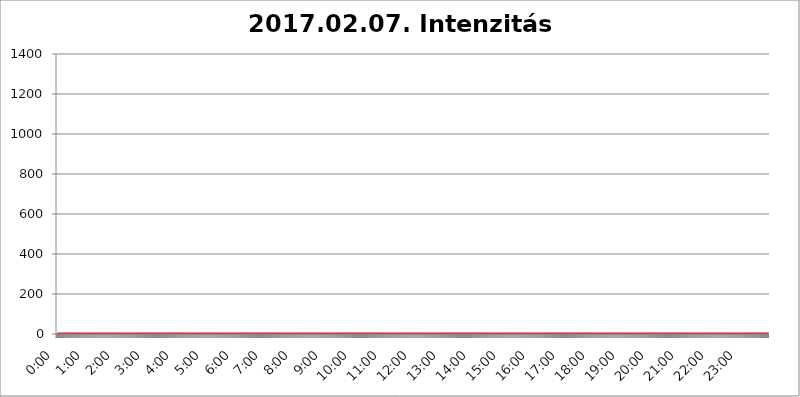
| Category | 2017.02.07. Intenzitás [W/m^2] |
|---|---|
| 0.0 | 0 |
| 0.0006944444444444445 | 0 |
| 0.001388888888888889 | 0 |
| 0.0020833333333333333 | 0 |
| 0.002777777777777778 | 0 |
| 0.003472222222222222 | 0 |
| 0.004166666666666667 | 0 |
| 0.004861111111111111 | 0 |
| 0.005555555555555556 | 0 |
| 0.0062499999999999995 | 0 |
| 0.006944444444444444 | 0 |
| 0.007638888888888889 | 0 |
| 0.008333333333333333 | 0 |
| 0.009027777777777779 | 0 |
| 0.009722222222222222 | 0 |
| 0.010416666666666666 | 0 |
| 0.011111111111111112 | 0 |
| 0.011805555555555555 | 0 |
| 0.012499999999999999 | 0 |
| 0.013194444444444444 | 0 |
| 0.013888888888888888 | 0 |
| 0.014583333333333332 | 0 |
| 0.015277777777777777 | 0 |
| 0.015972222222222224 | 0 |
| 0.016666666666666666 | 0 |
| 0.017361111111111112 | 0 |
| 0.018055555555555557 | 0 |
| 0.01875 | 0 |
| 0.019444444444444445 | 0 |
| 0.02013888888888889 | 0 |
| 0.020833333333333332 | 0 |
| 0.02152777777777778 | 0 |
| 0.022222222222222223 | 0 |
| 0.02291666666666667 | 0 |
| 0.02361111111111111 | 0 |
| 0.024305555555555556 | 0 |
| 0.024999999999999998 | 0 |
| 0.025694444444444447 | 0 |
| 0.02638888888888889 | 0 |
| 0.027083333333333334 | 0 |
| 0.027777777777777776 | 0 |
| 0.02847222222222222 | 0 |
| 0.029166666666666664 | 0 |
| 0.029861111111111113 | 0 |
| 0.030555555555555555 | 0 |
| 0.03125 | 0 |
| 0.03194444444444445 | 0 |
| 0.03263888888888889 | 0 |
| 0.03333333333333333 | 0 |
| 0.034027777777777775 | 0 |
| 0.034722222222222224 | 0 |
| 0.035416666666666666 | 0 |
| 0.036111111111111115 | 0 |
| 0.03680555555555556 | 0 |
| 0.0375 | 0 |
| 0.03819444444444444 | 0 |
| 0.03888888888888889 | 0 |
| 0.03958333333333333 | 0 |
| 0.04027777777777778 | 0 |
| 0.04097222222222222 | 0 |
| 0.041666666666666664 | 0 |
| 0.042361111111111106 | 0 |
| 0.04305555555555556 | 0 |
| 0.043750000000000004 | 0 |
| 0.044444444444444446 | 0 |
| 0.04513888888888889 | 0 |
| 0.04583333333333334 | 0 |
| 0.04652777777777778 | 0 |
| 0.04722222222222222 | 0 |
| 0.04791666666666666 | 0 |
| 0.04861111111111111 | 0 |
| 0.049305555555555554 | 0 |
| 0.049999999999999996 | 0 |
| 0.05069444444444445 | 0 |
| 0.051388888888888894 | 0 |
| 0.052083333333333336 | 0 |
| 0.05277777777777778 | 0 |
| 0.05347222222222222 | 0 |
| 0.05416666666666667 | 0 |
| 0.05486111111111111 | 0 |
| 0.05555555555555555 | 0 |
| 0.05625 | 0 |
| 0.05694444444444444 | 0 |
| 0.057638888888888885 | 0 |
| 0.05833333333333333 | 0 |
| 0.05902777777777778 | 0 |
| 0.059722222222222225 | 0 |
| 0.06041666666666667 | 0 |
| 0.061111111111111116 | 0 |
| 0.06180555555555556 | 0 |
| 0.0625 | 0 |
| 0.06319444444444444 | 0 |
| 0.06388888888888888 | 0 |
| 0.06458333333333334 | 0 |
| 0.06527777777777778 | 0 |
| 0.06597222222222222 | 0 |
| 0.06666666666666667 | 0 |
| 0.06736111111111111 | 0 |
| 0.06805555555555555 | 0 |
| 0.06874999999999999 | 0 |
| 0.06944444444444443 | 0 |
| 0.07013888888888889 | 0 |
| 0.07083333333333333 | 0 |
| 0.07152777777777779 | 0 |
| 0.07222222222222223 | 0 |
| 0.07291666666666667 | 0 |
| 0.07361111111111111 | 0 |
| 0.07430555555555556 | 0 |
| 0.075 | 0 |
| 0.07569444444444444 | 0 |
| 0.0763888888888889 | 0 |
| 0.07708333333333334 | 0 |
| 0.07777777777777778 | 0 |
| 0.07847222222222222 | 0 |
| 0.07916666666666666 | 0 |
| 0.0798611111111111 | 0 |
| 0.08055555555555556 | 0 |
| 0.08125 | 0 |
| 0.08194444444444444 | 0 |
| 0.08263888888888889 | 0 |
| 0.08333333333333333 | 0 |
| 0.08402777777777777 | 0 |
| 0.08472222222222221 | 0 |
| 0.08541666666666665 | 0 |
| 0.08611111111111112 | 0 |
| 0.08680555555555557 | 0 |
| 0.08750000000000001 | 0 |
| 0.08819444444444445 | 0 |
| 0.08888888888888889 | 0 |
| 0.08958333333333333 | 0 |
| 0.09027777777777778 | 0 |
| 0.09097222222222222 | 0 |
| 0.09166666666666667 | 0 |
| 0.09236111111111112 | 0 |
| 0.09305555555555556 | 0 |
| 0.09375 | 0 |
| 0.09444444444444444 | 0 |
| 0.09513888888888888 | 0 |
| 0.09583333333333333 | 0 |
| 0.09652777777777777 | 0 |
| 0.09722222222222222 | 0 |
| 0.09791666666666667 | 0 |
| 0.09861111111111111 | 0 |
| 0.09930555555555555 | 0 |
| 0.09999999999999999 | 0 |
| 0.10069444444444443 | 0 |
| 0.1013888888888889 | 0 |
| 0.10208333333333335 | 0 |
| 0.10277777777777779 | 0 |
| 0.10347222222222223 | 0 |
| 0.10416666666666667 | 0 |
| 0.10486111111111111 | 0 |
| 0.10555555555555556 | 0 |
| 0.10625 | 0 |
| 0.10694444444444444 | 0 |
| 0.1076388888888889 | 0 |
| 0.10833333333333334 | 0 |
| 0.10902777777777778 | 0 |
| 0.10972222222222222 | 0 |
| 0.1111111111111111 | 0 |
| 0.11180555555555556 | 0 |
| 0.11180555555555556 | 0 |
| 0.1125 | 0 |
| 0.11319444444444444 | 0 |
| 0.11388888888888889 | 0 |
| 0.11458333333333333 | 0 |
| 0.11527777777777777 | 0 |
| 0.11597222222222221 | 0 |
| 0.11666666666666665 | 0 |
| 0.1173611111111111 | 0 |
| 0.11805555555555557 | 0 |
| 0.11944444444444445 | 0 |
| 0.12013888888888889 | 0 |
| 0.12083333333333333 | 0 |
| 0.12152777777777778 | 0 |
| 0.12222222222222223 | 0 |
| 0.12291666666666667 | 0 |
| 0.12291666666666667 | 0 |
| 0.12361111111111112 | 0 |
| 0.12430555555555556 | 0 |
| 0.125 | 0 |
| 0.12569444444444444 | 0 |
| 0.12638888888888888 | 0 |
| 0.12708333333333333 | 0 |
| 0.16875 | 0 |
| 0.12847222222222224 | 0 |
| 0.12916666666666668 | 0 |
| 0.12986111111111112 | 0 |
| 0.13055555555555556 | 0 |
| 0.13125 | 0 |
| 0.13194444444444445 | 0 |
| 0.1326388888888889 | 0 |
| 0.13333333333333333 | 0 |
| 0.13402777777777777 | 0 |
| 0.13402777777777777 | 0 |
| 0.13472222222222222 | 0 |
| 0.13541666666666666 | 0 |
| 0.1361111111111111 | 0 |
| 0.13749999999999998 | 0 |
| 0.13819444444444443 | 0 |
| 0.1388888888888889 | 0 |
| 0.13958333333333334 | 0 |
| 0.14027777777777778 | 0 |
| 0.14097222222222222 | 0 |
| 0.14166666666666666 | 0 |
| 0.1423611111111111 | 0 |
| 0.14305555555555557 | 0 |
| 0.14375000000000002 | 0 |
| 0.14444444444444446 | 0 |
| 0.1451388888888889 | 0 |
| 0.1451388888888889 | 0 |
| 0.14652777777777778 | 0 |
| 0.14722222222222223 | 0 |
| 0.14791666666666667 | 0 |
| 0.1486111111111111 | 0 |
| 0.14930555555555555 | 0 |
| 0.15 | 0 |
| 0.15069444444444444 | 0 |
| 0.15138888888888888 | 0 |
| 0.15208333333333332 | 0 |
| 0.15277777777777776 | 0 |
| 0.15347222222222223 | 0 |
| 0.15416666666666667 | 0 |
| 0.15486111111111112 | 0 |
| 0.15555555555555556 | 0 |
| 0.15625 | 0 |
| 0.15694444444444444 | 0 |
| 0.15763888888888888 | 0 |
| 0.15833333333333333 | 0 |
| 0.15902777777777777 | 0 |
| 0.15972222222222224 | 0 |
| 0.16041666666666668 | 0 |
| 0.16111111111111112 | 0 |
| 0.16180555555555556 | 0 |
| 0.1625 | 0 |
| 0.16319444444444445 | 0 |
| 0.1638888888888889 | 0 |
| 0.16458333333333333 | 0 |
| 0.16527777777777777 | 0 |
| 0.16597222222222222 | 0 |
| 0.16666666666666666 | 0 |
| 0.1673611111111111 | 0 |
| 0.16805555555555554 | 0 |
| 0.16874999999999998 | 0 |
| 0.16944444444444443 | 0 |
| 0.17013888888888887 | 0 |
| 0.1708333333333333 | 0 |
| 0.17152777777777775 | 0 |
| 0.17222222222222225 | 0 |
| 0.1729166666666667 | 0 |
| 0.17361111111111113 | 0 |
| 0.17430555555555557 | 0 |
| 0.17500000000000002 | 0 |
| 0.17569444444444446 | 0 |
| 0.1763888888888889 | 0 |
| 0.17708333333333334 | 0 |
| 0.17777777777777778 | 0 |
| 0.17847222222222223 | 0 |
| 0.17916666666666667 | 0 |
| 0.1798611111111111 | 0 |
| 0.18055555555555555 | 0 |
| 0.18125 | 0 |
| 0.18194444444444444 | 0 |
| 0.1826388888888889 | 0 |
| 0.18333333333333335 | 0 |
| 0.1840277777777778 | 0 |
| 0.18472222222222223 | 0 |
| 0.18541666666666667 | 0 |
| 0.18611111111111112 | 0 |
| 0.18680555555555556 | 0 |
| 0.1875 | 0 |
| 0.18819444444444444 | 0 |
| 0.18888888888888888 | 0 |
| 0.18958333333333333 | 0 |
| 0.19027777777777777 | 0 |
| 0.1909722222222222 | 0 |
| 0.19166666666666665 | 0 |
| 0.19236111111111112 | 0 |
| 0.19305555555555554 | 0 |
| 0.19375 | 0 |
| 0.19444444444444445 | 0 |
| 0.1951388888888889 | 0 |
| 0.19583333333333333 | 0 |
| 0.19652777777777777 | 0 |
| 0.19722222222222222 | 0 |
| 0.19791666666666666 | 0 |
| 0.1986111111111111 | 0 |
| 0.19930555555555554 | 0 |
| 0.19999999999999998 | 0 |
| 0.20069444444444443 | 0 |
| 0.20138888888888887 | 0 |
| 0.2020833333333333 | 0 |
| 0.2027777777777778 | 0 |
| 0.2034722222222222 | 0 |
| 0.2041666666666667 | 0 |
| 0.20486111111111113 | 0 |
| 0.20555555555555557 | 0 |
| 0.20625000000000002 | 0 |
| 0.20694444444444446 | 0 |
| 0.2076388888888889 | 0 |
| 0.20833333333333334 | 0 |
| 0.20902777777777778 | 0 |
| 0.20972222222222223 | 0 |
| 0.21041666666666667 | 0 |
| 0.2111111111111111 | 0 |
| 0.21180555555555555 | 0 |
| 0.2125 | 0 |
| 0.21319444444444444 | 0 |
| 0.2138888888888889 | 0 |
| 0.21458333333333335 | 0 |
| 0.2152777777777778 | 0 |
| 0.21597222222222223 | 0 |
| 0.21666666666666667 | 0 |
| 0.21736111111111112 | 0 |
| 0.21805555555555556 | 0 |
| 0.21875 | 0 |
| 0.21944444444444444 | 0 |
| 0.22013888888888888 | 0 |
| 0.22083333333333333 | 0 |
| 0.22152777777777777 | 0 |
| 0.2222222222222222 | 0 |
| 0.22291666666666665 | 0 |
| 0.2236111111111111 | 0 |
| 0.22430555555555556 | 0 |
| 0.225 | 0 |
| 0.22569444444444445 | 0 |
| 0.2263888888888889 | 0 |
| 0.22708333333333333 | 0 |
| 0.22777777777777777 | 0 |
| 0.22847222222222222 | 0 |
| 0.22916666666666666 | 0 |
| 0.2298611111111111 | 0 |
| 0.23055555555555554 | 0 |
| 0.23124999999999998 | 0 |
| 0.23194444444444443 | 0 |
| 0.23263888888888887 | 0 |
| 0.2333333333333333 | 0 |
| 0.2340277777777778 | 0 |
| 0.2347222222222222 | 0 |
| 0.2354166666666667 | 0 |
| 0.23611111111111113 | 0 |
| 0.23680555555555557 | 0 |
| 0.23750000000000002 | 0 |
| 0.23819444444444446 | 0 |
| 0.2388888888888889 | 0 |
| 0.23958333333333334 | 0 |
| 0.24027777777777778 | 0 |
| 0.24097222222222223 | 0 |
| 0.24166666666666667 | 0 |
| 0.2423611111111111 | 0 |
| 0.24305555555555555 | 0 |
| 0.24375 | 0 |
| 0.24444444444444446 | 0 |
| 0.24513888888888888 | 0 |
| 0.24583333333333335 | 0 |
| 0.2465277777777778 | 0 |
| 0.24722222222222223 | 0 |
| 0.24791666666666667 | 0 |
| 0.24861111111111112 | 0 |
| 0.24930555555555556 | 0 |
| 0.25 | 0 |
| 0.25069444444444444 | 0 |
| 0.2513888888888889 | 0 |
| 0.2520833333333333 | 0 |
| 0.25277777777777777 | 0 |
| 0.2534722222222222 | 0 |
| 0.25416666666666665 | 0 |
| 0.2548611111111111 | 0 |
| 0.2555555555555556 | 0 |
| 0.25625000000000003 | 0 |
| 0.2569444444444445 | 0 |
| 0.2576388888888889 | 0 |
| 0.25833333333333336 | 0 |
| 0.2590277777777778 | 0 |
| 0.25972222222222224 | 0 |
| 0.2604166666666667 | 0 |
| 0.2611111111111111 | 0 |
| 0.26180555555555557 | 0 |
| 0.2625 | 0 |
| 0.26319444444444445 | 0 |
| 0.2638888888888889 | 0 |
| 0.26458333333333334 | 0 |
| 0.2652777777777778 | 0 |
| 0.2659722222222222 | 0 |
| 0.26666666666666666 | 0 |
| 0.2673611111111111 | 0 |
| 0.26805555555555555 | 0 |
| 0.26875 | 0 |
| 0.26944444444444443 | 0 |
| 0.2701388888888889 | 0 |
| 0.2708333333333333 | 0 |
| 0.27152777777777776 | 0 |
| 0.2722222222222222 | 0 |
| 0.27291666666666664 | 0 |
| 0.2736111111111111 | 0 |
| 0.2743055555555555 | 0 |
| 0.27499999999999997 | 0 |
| 0.27569444444444446 | 0 |
| 0.27638888888888885 | 0 |
| 0.27708333333333335 | 0 |
| 0.2777777777777778 | 0 |
| 0.27847222222222223 | 0 |
| 0.2791666666666667 | 0 |
| 0.2798611111111111 | 0 |
| 0.28055555555555556 | 0 |
| 0.28125 | 0 |
| 0.28194444444444444 | 0 |
| 0.2826388888888889 | 0 |
| 0.2833333333333333 | 0 |
| 0.28402777777777777 | 0 |
| 0.2847222222222222 | 0 |
| 0.28541666666666665 | 0 |
| 0.28611111111111115 | 0 |
| 0.28680555555555554 | 0 |
| 0.28750000000000003 | 0 |
| 0.2881944444444445 | 0 |
| 0.2888888888888889 | 0 |
| 0.28958333333333336 | 0 |
| 0.2902777777777778 | 0 |
| 0.29097222222222224 | 0 |
| 0.2916666666666667 | 0 |
| 0.2923611111111111 | 0 |
| 0.29305555555555557 | 0 |
| 0.29375 | 0 |
| 0.29444444444444445 | 0 |
| 0.2951388888888889 | 0 |
| 0.29583333333333334 | 0 |
| 0.2965277777777778 | 0 |
| 0.2972222222222222 | 0 |
| 0.29791666666666666 | 0 |
| 0.2986111111111111 | 0 |
| 0.29930555555555555 | 0 |
| 0.3 | 0 |
| 0.30069444444444443 | 0 |
| 0.3013888888888889 | 0 |
| 0.3020833333333333 | 0 |
| 0.30277777777777776 | 0 |
| 0.3034722222222222 | 0 |
| 0.30416666666666664 | 0 |
| 0.3048611111111111 | 0 |
| 0.3055555555555555 | 0 |
| 0.30624999999999997 | 0 |
| 0.3069444444444444 | 0 |
| 0.3076388888888889 | 0 |
| 0.30833333333333335 | 0 |
| 0.3090277777777778 | 0 |
| 0.30972222222222223 | 0 |
| 0.3104166666666667 | 0 |
| 0.3111111111111111 | 0 |
| 0.31180555555555556 | 0 |
| 0.3125 | 0 |
| 0.31319444444444444 | 0 |
| 0.3138888888888889 | 0 |
| 0.3145833333333333 | 0 |
| 0.31527777777777777 | 0 |
| 0.3159722222222222 | 0 |
| 0.31666666666666665 | 0 |
| 0.31736111111111115 | 0 |
| 0.31805555555555554 | 0 |
| 0.31875000000000003 | 0 |
| 0.3194444444444445 | 0 |
| 0.3201388888888889 | 0 |
| 0.32083333333333336 | 0 |
| 0.3215277777777778 | 0 |
| 0.32222222222222224 | 0 |
| 0.3229166666666667 | 0 |
| 0.3236111111111111 | 0 |
| 0.32430555555555557 | 0 |
| 0.325 | 0 |
| 0.32569444444444445 | 0 |
| 0.3263888888888889 | 0 |
| 0.32708333333333334 | 0 |
| 0.3277777777777778 | 0 |
| 0.3284722222222222 | 0 |
| 0.32916666666666666 | 0 |
| 0.3298611111111111 | 0 |
| 0.33055555555555555 | 0 |
| 0.33125 | 0 |
| 0.33194444444444443 | 0 |
| 0.3326388888888889 | 0 |
| 0.3333333333333333 | 0 |
| 0.3340277777777778 | 0 |
| 0.3347222222222222 | 0 |
| 0.3354166666666667 | 0 |
| 0.3361111111111111 | 0 |
| 0.3368055555555556 | 0 |
| 0.33749999999999997 | 0 |
| 0.33819444444444446 | 0 |
| 0.33888888888888885 | 0 |
| 0.33958333333333335 | 0 |
| 0.34027777777777773 | 0 |
| 0.34097222222222223 | 0 |
| 0.3416666666666666 | 0 |
| 0.3423611111111111 | 0 |
| 0.3430555555555555 | 0 |
| 0.34375 | 0 |
| 0.3444444444444445 | 0 |
| 0.3451388888888889 | 0 |
| 0.3458333333333334 | 0 |
| 0.34652777777777777 | 0 |
| 0.34722222222222227 | 0 |
| 0.34791666666666665 | 0 |
| 0.34861111111111115 | 0 |
| 0.34930555555555554 | 0 |
| 0.35000000000000003 | 0 |
| 0.3506944444444444 | 0 |
| 0.3513888888888889 | 0 |
| 0.3520833333333333 | 0 |
| 0.3527777777777778 | 0 |
| 0.3534722222222222 | 0 |
| 0.3541666666666667 | 0 |
| 0.3548611111111111 | 0 |
| 0.35555555555555557 | 0 |
| 0.35625 | 0 |
| 0.35694444444444445 | 0 |
| 0.3576388888888889 | 0 |
| 0.35833333333333334 | 0 |
| 0.3590277777777778 | 0 |
| 0.3597222222222222 | 0 |
| 0.36041666666666666 | 0 |
| 0.3611111111111111 | 0 |
| 0.36180555555555555 | 0 |
| 0.3625 | 0 |
| 0.36319444444444443 | 0 |
| 0.3638888888888889 | 0 |
| 0.3645833333333333 | 0 |
| 0.3652777777777778 | 0 |
| 0.3659722222222222 | 0 |
| 0.3666666666666667 | 0 |
| 0.3673611111111111 | 0 |
| 0.3680555555555556 | 0 |
| 0.36874999999999997 | 0 |
| 0.36944444444444446 | 0 |
| 0.37013888888888885 | 0 |
| 0.37083333333333335 | 0 |
| 0.37152777777777773 | 0 |
| 0.37222222222222223 | 0 |
| 0.3729166666666666 | 0 |
| 0.3736111111111111 | 0 |
| 0.3743055555555555 | 0 |
| 0.375 | 0 |
| 0.3756944444444445 | 0 |
| 0.3763888888888889 | 0 |
| 0.3770833333333334 | 0 |
| 0.37777777777777777 | 0 |
| 0.37847222222222227 | 0 |
| 0.37916666666666665 | 0 |
| 0.37986111111111115 | 0 |
| 0.38055555555555554 | 0 |
| 0.38125000000000003 | 0 |
| 0.3819444444444444 | 0 |
| 0.3826388888888889 | 0 |
| 0.3833333333333333 | 0 |
| 0.3840277777777778 | 0 |
| 0.3847222222222222 | 0 |
| 0.3854166666666667 | 0 |
| 0.3861111111111111 | 0 |
| 0.38680555555555557 | 0 |
| 0.3875 | 0 |
| 0.38819444444444445 | 0 |
| 0.3888888888888889 | 0 |
| 0.38958333333333334 | 0 |
| 0.3902777777777778 | 0 |
| 0.3909722222222222 | 0 |
| 0.39166666666666666 | 0 |
| 0.3923611111111111 | 0 |
| 0.39305555555555555 | 0 |
| 0.39375 | 0 |
| 0.39444444444444443 | 0 |
| 0.3951388888888889 | 0 |
| 0.3958333333333333 | 0 |
| 0.3965277777777778 | 0 |
| 0.3972222222222222 | 0 |
| 0.3979166666666667 | 0 |
| 0.3986111111111111 | 0 |
| 0.3993055555555556 | 0 |
| 0.39999999999999997 | 0 |
| 0.40069444444444446 | 0 |
| 0.40138888888888885 | 0 |
| 0.40208333333333335 | 0 |
| 0.40277777777777773 | 0 |
| 0.40347222222222223 | 0 |
| 0.4041666666666666 | 0 |
| 0.4048611111111111 | 0 |
| 0.4055555555555555 | 0 |
| 0.40625 | 0 |
| 0.4069444444444445 | 0 |
| 0.4076388888888889 | 0 |
| 0.4083333333333334 | 0 |
| 0.40902777777777777 | 0 |
| 0.40972222222222227 | 0 |
| 0.41041666666666665 | 0 |
| 0.41111111111111115 | 0 |
| 0.41180555555555554 | 0 |
| 0.41250000000000003 | 0 |
| 0.4131944444444444 | 0 |
| 0.4138888888888889 | 0 |
| 0.4145833333333333 | 0 |
| 0.4152777777777778 | 0 |
| 0.4159722222222222 | 0 |
| 0.4166666666666667 | 0 |
| 0.4173611111111111 | 0 |
| 0.41805555555555557 | 0 |
| 0.41875 | 0 |
| 0.41944444444444445 | 0 |
| 0.4201388888888889 | 0 |
| 0.42083333333333334 | 0 |
| 0.4215277777777778 | 0 |
| 0.4222222222222222 | 0 |
| 0.42291666666666666 | 0 |
| 0.4236111111111111 | 0 |
| 0.42430555555555555 | 0 |
| 0.425 | 0 |
| 0.42569444444444443 | 0 |
| 0.4263888888888889 | 0 |
| 0.4270833333333333 | 0 |
| 0.4277777777777778 | 0 |
| 0.4284722222222222 | 0 |
| 0.4291666666666667 | 0 |
| 0.4298611111111111 | 0 |
| 0.4305555555555556 | 0 |
| 0.43124999999999997 | 0 |
| 0.43194444444444446 | 0 |
| 0.43263888888888885 | 0 |
| 0.43333333333333335 | 0 |
| 0.43402777777777773 | 0 |
| 0.43472222222222223 | 0 |
| 0.4354166666666666 | 0 |
| 0.4361111111111111 | 0 |
| 0.4368055555555555 | 0 |
| 0.4375 | 0 |
| 0.4381944444444445 | 0 |
| 0.4388888888888889 | 0 |
| 0.4395833333333334 | 0 |
| 0.44027777777777777 | 0 |
| 0.44097222222222227 | 0 |
| 0.44166666666666665 | 0 |
| 0.44236111111111115 | 0 |
| 0.44305555555555554 | 0 |
| 0.44375000000000003 | 0 |
| 0.4444444444444444 | 0 |
| 0.4451388888888889 | 0 |
| 0.4458333333333333 | 0 |
| 0.4465277777777778 | 0 |
| 0.4472222222222222 | 0 |
| 0.4479166666666667 | 0 |
| 0.4486111111111111 | 0 |
| 0.44930555555555557 | 0 |
| 0.45 | 0 |
| 0.45069444444444445 | 0 |
| 0.4513888888888889 | 0 |
| 0.45208333333333334 | 0 |
| 0.4527777777777778 | 0 |
| 0.4534722222222222 | 0 |
| 0.45416666666666666 | 0 |
| 0.4548611111111111 | 0 |
| 0.45555555555555555 | 0 |
| 0.45625 | 0 |
| 0.45694444444444443 | 0 |
| 0.4576388888888889 | 0 |
| 0.4583333333333333 | 0 |
| 0.4590277777777778 | 0 |
| 0.4597222222222222 | 0 |
| 0.4604166666666667 | 0 |
| 0.4611111111111111 | 0 |
| 0.4618055555555556 | 0 |
| 0.46249999999999997 | 0 |
| 0.46319444444444446 | 0 |
| 0.46388888888888885 | 0 |
| 0.46458333333333335 | 0 |
| 0.46527777777777773 | 0 |
| 0.46597222222222223 | 0 |
| 0.4666666666666666 | 0 |
| 0.4673611111111111 | 0 |
| 0.4680555555555555 | 0 |
| 0.46875 | 0 |
| 0.4694444444444445 | 0 |
| 0.4701388888888889 | 0 |
| 0.4708333333333334 | 0 |
| 0.47152777777777777 | 0 |
| 0.47222222222222227 | 0 |
| 0.47291666666666665 | 0 |
| 0.47361111111111115 | 0 |
| 0.47430555555555554 | 0 |
| 0.47500000000000003 | 0 |
| 0.4756944444444444 | 0 |
| 0.4763888888888889 | 0 |
| 0.4770833333333333 | 0 |
| 0.4777777777777778 | 0 |
| 0.4784722222222222 | 0 |
| 0.4791666666666667 | 0 |
| 0.4798611111111111 | 0 |
| 0.48055555555555557 | 0 |
| 0.48125 | 0 |
| 0.48194444444444445 | 0 |
| 0.4826388888888889 | 0 |
| 0.48333333333333334 | 0 |
| 0.4840277777777778 | 0 |
| 0.4847222222222222 | 0 |
| 0.48541666666666666 | 0 |
| 0.4861111111111111 | 0 |
| 0.48680555555555555 | 0 |
| 0.4875 | 0 |
| 0.48819444444444443 | 0 |
| 0.4888888888888889 | 0 |
| 0.4895833333333333 | 0 |
| 0.4902777777777778 | 0 |
| 0.4909722222222222 | 0 |
| 0.4916666666666667 | 0 |
| 0.4923611111111111 | 0 |
| 0.4930555555555556 | 0 |
| 0.49374999999999997 | 0 |
| 0.49444444444444446 | 0 |
| 0.49513888888888885 | 0 |
| 0.49583333333333335 | 0 |
| 0.49652777777777773 | 0 |
| 0.49722222222222223 | 0 |
| 0.4979166666666666 | 0 |
| 0.4986111111111111 | 0 |
| 0.4993055555555555 | 0 |
| 0.5 | 0 |
| 0.5006944444444444 | 0 |
| 0.5013888888888889 | 0 |
| 0.5020833333333333 | 0 |
| 0.5027777777777778 | 0 |
| 0.5034722222222222 | 0 |
| 0.5041666666666667 | 0 |
| 0.5048611111111111 | 0 |
| 0.5055555555555555 | 0 |
| 0.50625 | 0 |
| 0.5069444444444444 | 0 |
| 0.5076388888888889 | 0 |
| 0.5083333333333333 | 0 |
| 0.5090277777777777 | 0 |
| 0.5097222222222222 | 0 |
| 0.5104166666666666 | 0 |
| 0.5111111111111112 | 0 |
| 0.5118055555555555 | 0 |
| 0.5125000000000001 | 0 |
| 0.5131944444444444 | 0 |
| 0.513888888888889 | 0 |
| 0.5145833333333333 | 0 |
| 0.5152777777777778 | 0 |
| 0.5159722222222222 | 0 |
| 0.5166666666666667 | 0 |
| 0.517361111111111 | 0 |
| 0.5180555555555556 | 0 |
| 0.5187499999999999 | 0 |
| 0.5194444444444445 | 0 |
| 0.5201388888888888 | 0 |
| 0.5208333333333334 | 0 |
| 0.5215277777777778 | 0 |
| 0.5222222222222223 | 0 |
| 0.5229166666666667 | 0 |
| 0.5236111111111111 | 0 |
| 0.5243055555555556 | 0 |
| 0.525 | 0 |
| 0.5256944444444445 | 0 |
| 0.5263888888888889 | 0 |
| 0.5270833333333333 | 0 |
| 0.5277777777777778 | 0 |
| 0.5284722222222222 | 0 |
| 0.5291666666666667 | 0 |
| 0.5298611111111111 | 0 |
| 0.5305555555555556 | 0 |
| 0.53125 | 0 |
| 0.5319444444444444 | 0 |
| 0.5326388888888889 | 0 |
| 0.5333333333333333 | 0 |
| 0.5340277777777778 | 0 |
| 0.5347222222222222 | 0 |
| 0.5354166666666667 | 0 |
| 0.5361111111111111 | 0 |
| 0.5368055555555555 | 0 |
| 0.5375 | 0 |
| 0.5381944444444444 | 0 |
| 0.5388888888888889 | 0 |
| 0.5395833333333333 | 0 |
| 0.5402777777777777 | 0 |
| 0.5409722222222222 | 0 |
| 0.5416666666666666 | 0 |
| 0.5423611111111112 | 0 |
| 0.5430555555555555 | 0 |
| 0.5437500000000001 | 0 |
| 0.5444444444444444 | 0 |
| 0.545138888888889 | 0 |
| 0.5458333333333333 | 0 |
| 0.5465277777777778 | 0 |
| 0.5472222222222222 | 0 |
| 0.5479166666666667 | 0 |
| 0.548611111111111 | 0 |
| 0.5493055555555556 | 0 |
| 0.5499999999999999 | 0 |
| 0.5506944444444445 | 0 |
| 0.5513888888888888 | 0 |
| 0.5520833333333334 | 0 |
| 0.5527777777777778 | 0 |
| 0.5534722222222223 | 0 |
| 0.5541666666666667 | 0 |
| 0.5548611111111111 | 0 |
| 0.5555555555555556 | 0 |
| 0.55625 | 0 |
| 0.5569444444444445 | 0 |
| 0.5576388888888889 | 0 |
| 0.5583333333333333 | 0 |
| 0.5590277777777778 | 0 |
| 0.5597222222222222 | 0 |
| 0.5604166666666667 | 0 |
| 0.5611111111111111 | 0 |
| 0.5618055555555556 | 0 |
| 0.5625 | 0 |
| 0.5631944444444444 | 0 |
| 0.5638888888888889 | 0 |
| 0.5645833333333333 | 0 |
| 0.5652777777777778 | 0 |
| 0.5659722222222222 | 0 |
| 0.5666666666666667 | 0 |
| 0.5673611111111111 | 0 |
| 0.5680555555555555 | 0 |
| 0.56875 | 0 |
| 0.5694444444444444 | 0 |
| 0.5701388888888889 | 0 |
| 0.5708333333333333 | 0 |
| 0.5715277777777777 | 0 |
| 0.5722222222222222 | 0 |
| 0.5729166666666666 | 0 |
| 0.5736111111111112 | 0 |
| 0.5743055555555555 | 0 |
| 0.5750000000000001 | 0 |
| 0.5756944444444444 | 0 |
| 0.576388888888889 | 0 |
| 0.5770833333333333 | 0 |
| 0.5777777777777778 | 0 |
| 0.5784722222222222 | 0 |
| 0.5791666666666667 | 0 |
| 0.579861111111111 | 0 |
| 0.5805555555555556 | 0 |
| 0.5812499999999999 | 0 |
| 0.5819444444444445 | 0 |
| 0.5826388888888888 | 0 |
| 0.5833333333333334 | 0 |
| 0.5840277777777778 | 0 |
| 0.5847222222222223 | 0 |
| 0.5854166666666667 | 0 |
| 0.5861111111111111 | 0 |
| 0.5868055555555556 | 0 |
| 0.5875 | 0 |
| 0.5881944444444445 | 0 |
| 0.5888888888888889 | 0 |
| 0.5895833333333333 | 0 |
| 0.5902777777777778 | 0 |
| 0.5909722222222222 | 0 |
| 0.5916666666666667 | 0 |
| 0.5923611111111111 | 0 |
| 0.5930555555555556 | 0 |
| 0.59375 | 0 |
| 0.5944444444444444 | 0 |
| 0.5951388888888889 | 0 |
| 0.5958333333333333 | 0 |
| 0.5965277777777778 | 0 |
| 0.5972222222222222 | 0 |
| 0.5979166666666667 | 0 |
| 0.5986111111111111 | 0 |
| 0.5993055555555555 | 0 |
| 0.6 | 0 |
| 0.6006944444444444 | 0 |
| 0.6013888888888889 | 0 |
| 0.6020833333333333 | 0 |
| 0.6027777777777777 | 0 |
| 0.6034722222222222 | 0 |
| 0.6041666666666666 | 0 |
| 0.6048611111111112 | 0 |
| 0.6055555555555555 | 0 |
| 0.6062500000000001 | 0 |
| 0.6069444444444444 | 0 |
| 0.607638888888889 | 0 |
| 0.6083333333333333 | 0 |
| 0.6090277777777778 | 0 |
| 0.6097222222222222 | 0 |
| 0.6104166666666667 | 0 |
| 0.611111111111111 | 0 |
| 0.6118055555555556 | 0 |
| 0.6124999999999999 | 0 |
| 0.6131944444444445 | 0 |
| 0.6138888888888888 | 0 |
| 0.6145833333333334 | 0 |
| 0.6152777777777778 | 0 |
| 0.6159722222222223 | 0 |
| 0.6166666666666667 | 0 |
| 0.6173611111111111 | 0 |
| 0.6180555555555556 | 0 |
| 0.61875 | 0 |
| 0.6194444444444445 | 0 |
| 0.6201388888888889 | 0 |
| 0.6208333333333333 | 0 |
| 0.6215277777777778 | 0 |
| 0.6222222222222222 | 0 |
| 0.6229166666666667 | 0 |
| 0.6236111111111111 | 0 |
| 0.6243055555555556 | 0 |
| 0.625 | 0 |
| 0.6256944444444444 | 0 |
| 0.6263888888888889 | 0 |
| 0.6270833333333333 | 0 |
| 0.6277777777777778 | 0 |
| 0.6284722222222222 | 0 |
| 0.6291666666666667 | 0 |
| 0.6298611111111111 | 0 |
| 0.6305555555555555 | 0 |
| 0.63125 | 0 |
| 0.6319444444444444 | 0 |
| 0.6326388888888889 | 0 |
| 0.6333333333333333 | 0 |
| 0.6340277777777777 | 0 |
| 0.6347222222222222 | 0 |
| 0.6354166666666666 | 0 |
| 0.6361111111111112 | 0 |
| 0.6368055555555555 | 0 |
| 0.6375000000000001 | 0 |
| 0.6381944444444444 | 0 |
| 0.638888888888889 | 0 |
| 0.6395833333333333 | 0 |
| 0.6402777777777778 | 0 |
| 0.6409722222222222 | 0 |
| 0.6416666666666667 | 0 |
| 0.642361111111111 | 0 |
| 0.6430555555555556 | 0 |
| 0.6437499999999999 | 0 |
| 0.6444444444444445 | 0 |
| 0.6451388888888888 | 0 |
| 0.6458333333333334 | 0 |
| 0.6465277777777778 | 0 |
| 0.6472222222222223 | 0 |
| 0.6479166666666667 | 0 |
| 0.6486111111111111 | 0 |
| 0.6493055555555556 | 0 |
| 0.65 | 0 |
| 0.6506944444444445 | 0 |
| 0.6513888888888889 | 0 |
| 0.6520833333333333 | 0 |
| 0.6527777777777778 | 0 |
| 0.6534722222222222 | 0 |
| 0.6541666666666667 | 0 |
| 0.6548611111111111 | 0 |
| 0.6555555555555556 | 0 |
| 0.65625 | 0 |
| 0.6569444444444444 | 0 |
| 0.6576388888888889 | 0 |
| 0.6583333333333333 | 0 |
| 0.6590277777777778 | 0 |
| 0.6597222222222222 | 0 |
| 0.6604166666666667 | 0 |
| 0.6611111111111111 | 0 |
| 0.6618055555555555 | 0 |
| 0.6625 | 0 |
| 0.6631944444444444 | 0 |
| 0.6638888888888889 | 0 |
| 0.6645833333333333 | 0 |
| 0.6652777777777777 | 0 |
| 0.6659722222222222 | 0 |
| 0.6666666666666666 | 0 |
| 0.6673611111111111 | 0 |
| 0.6680555555555556 | 0 |
| 0.6687500000000001 | 0 |
| 0.6694444444444444 | 0 |
| 0.6701388888888888 | 0 |
| 0.6708333333333334 | 0 |
| 0.6715277777777778 | 0 |
| 0.6722222222222222 | 0 |
| 0.6729166666666666 | 0 |
| 0.6736111111111112 | 0 |
| 0.6743055555555556 | 0 |
| 0.6749999999999999 | 0 |
| 0.6756944444444444 | 0 |
| 0.6763888888888889 | 0 |
| 0.6770833333333334 | 0 |
| 0.6777777777777777 | 0 |
| 0.6784722222222223 | 0 |
| 0.6791666666666667 | 0 |
| 0.6798611111111111 | 0 |
| 0.6805555555555555 | 0 |
| 0.68125 | 0 |
| 0.6819444444444445 | 0 |
| 0.6826388888888889 | 0 |
| 0.6833333333333332 | 0 |
| 0.6840277777777778 | 0 |
| 0.6847222222222222 | 0 |
| 0.6854166666666667 | 0 |
| 0.686111111111111 | 0 |
| 0.6868055555555556 | 0 |
| 0.6875 | 0 |
| 0.6881944444444444 | 0 |
| 0.688888888888889 | 0 |
| 0.6895833333333333 | 0 |
| 0.6902777777777778 | 0 |
| 0.6909722222222222 | 0 |
| 0.6916666666666668 | 0 |
| 0.6923611111111111 | 0 |
| 0.6930555555555555 | 0 |
| 0.69375 | 0 |
| 0.6944444444444445 | 0 |
| 0.6951388888888889 | 0 |
| 0.6958333333333333 | 0 |
| 0.6965277777777777 | 0 |
| 0.6972222222222223 | 0 |
| 0.6979166666666666 | 0 |
| 0.6986111111111111 | 0 |
| 0.6993055555555556 | 0 |
| 0.7000000000000001 | 0 |
| 0.7006944444444444 | 0 |
| 0.7013888888888888 | 0 |
| 0.7020833333333334 | 0 |
| 0.7027777777777778 | 0 |
| 0.7034722222222222 | 0 |
| 0.7041666666666666 | 0 |
| 0.7048611111111112 | 0 |
| 0.7055555555555556 | 0 |
| 0.7062499999999999 | 0 |
| 0.7069444444444444 | 0 |
| 0.7076388888888889 | 0 |
| 0.7083333333333334 | 0 |
| 0.7090277777777777 | 0 |
| 0.7097222222222223 | 0 |
| 0.7104166666666667 | 0 |
| 0.7111111111111111 | 0 |
| 0.7118055555555555 | 0 |
| 0.7125 | 0 |
| 0.7131944444444445 | 0 |
| 0.7138888888888889 | 0 |
| 0.7145833333333332 | 0 |
| 0.7152777777777778 | 0 |
| 0.7159722222222222 | 0 |
| 0.7166666666666667 | 0 |
| 0.717361111111111 | 0 |
| 0.7180555555555556 | 0 |
| 0.71875 | 0 |
| 0.7194444444444444 | 0 |
| 0.720138888888889 | 0 |
| 0.7208333333333333 | 0 |
| 0.7215277777777778 | 0 |
| 0.7222222222222222 | 0 |
| 0.7229166666666668 | 0 |
| 0.7236111111111111 | 0 |
| 0.7243055555555555 | 0 |
| 0.725 | 0 |
| 0.7256944444444445 | 0 |
| 0.7263888888888889 | 0 |
| 0.7270833333333333 | 0 |
| 0.7277777777777777 | 0 |
| 0.7284722222222223 | 0 |
| 0.7291666666666666 | 0 |
| 0.7298611111111111 | 0 |
| 0.7305555555555556 | 0 |
| 0.7312500000000001 | 0 |
| 0.7319444444444444 | 0 |
| 0.7326388888888888 | 0 |
| 0.7333333333333334 | 0 |
| 0.7340277777777778 | 0 |
| 0.7347222222222222 | 0 |
| 0.7354166666666666 | 0 |
| 0.7361111111111112 | 0 |
| 0.7368055555555556 | 0 |
| 0.7374999999999999 | 0 |
| 0.7381944444444444 | 0 |
| 0.7388888888888889 | 0 |
| 0.7395833333333334 | 0 |
| 0.7402777777777777 | 0 |
| 0.7409722222222223 | 0 |
| 0.7416666666666667 | 0 |
| 0.7423611111111111 | 0 |
| 0.7430555555555555 | 0 |
| 0.74375 | 0 |
| 0.7444444444444445 | 0 |
| 0.7451388888888889 | 0 |
| 0.7458333333333332 | 0 |
| 0.7465277777777778 | 0 |
| 0.7472222222222222 | 0 |
| 0.7479166666666667 | 0 |
| 0.748611111111111 | 0 |
| 0.7493055555555556 | 0 |
| 0.75 | 0 |
| 0.7506944444444444 | 0 |
| 0.751388888888889 | 0 |
| 0.7520833333333333 | 0 |
| 0.7527777777777778 | 0 |
| 0.7534722222222222 | 0 |
| 0.7541666666666668 | 0 |
| 0.7548611111111111 | 0 |
| 0.7555555555555555 | 0 |
| 0.75625 | 0 |
| 0.7569444444444445 | 0 |
| 0.7576388888888889 | 0 |
| 0.7583333333333333 | 0 |
| 0.7590277777777777 | 0 |
| 0.7597222222222223 | 0 |
| 0.7604166666666666 | 0 |
| 0.7611111111111111 | 0 |
| 0.7618055555555556 | 0 |
| 0.7625000000000001 | 0 |
| 0.7631944444444444 | 0 |
| 0.7638888888888888 | 0 |
| 0.7645833333333334 | 0 |
| 0.7652777777777778 | 0 |
| 0.7659722222222222 | 0 |
| 0.7666666666666666 | 0 |
| 0.7673611111111112 | 0 |
| 0.7680555555555556 | 0 |
| 0.7687499999999999 | 0 |
| 0.7694444444444444 | 0 |
| 0.7701388888888889 | 0 |
| 0.7708333333333334 | 0 |
| 0.7715277777777777 | 0 |
| 0.7722222222222223 | 0 |
| 0.7729166666666667 | 0 |
| 0.7736111111111111 | 0 |
| 0.7743055555555555 | 0 |
| 0.775 | 0 |
| 0.7756944444444445 | 0 |
| 0.7763888888888889 | 0 |
| 0.7770833333333332 | 0 |
| 0.7777777777777778 | 0 |
| 0.7784722222222222 | 0 |
| 0.7791666666666667 | 0 |
| 0.779861111111111 | 0 |
| 0.7805555555555556 | 0 |
| 0.78125 | 0 |
| 0.7819444444444444 | 0 |
| 0.782638888888889 | 0 |
| 0.7833333333333333 | 0 |
| 0.7840277777777778 | 0 |
| 0.7847222222222222 | 0 |
| 0.7854166666666668 | 0 |
| 0.7861111111111111 | 0 |
| 0.7868055555555555 | 0 |
| 0.7875 | 0 |
| 0.7881944444444445 | 0 |
| 0.7888888888888889 | 0 |
| 0.7895833333333333 | 0 |
| 0.7902777777777777 | 0 |
| 0.7909722222222223 | 0 |
| 0.7916666666666666 | 0 |
| 0.7923611111111111 | 0 |
| 0.7930555555555556 | 0 |
| 0.7937500000000001 | 0 |
| 0.7944444444444444 | 0 |
| 0.7951388888888888 | 0 |
| 0.7958333333333334 | 0 |
| 0.7965277777777778 | 0 |
| 0.7972222222222222 | 0 |
| 0.7979166666666666 | 0 |
| 0.7986111111111112 | 0 |
| 0.7993055555555556 | 0 |
| 0.7999999999999999 | 0 |
| 0.8006944444444444 | 0 |
| 0.8013888888888889 | 0 |
| 0.8020833333333334 | 0 |
| 0.8027777777777777 | 0 |
| 0.8034722222222223 | 0 |
| 0.8041666666666667 | 0 |
| 0.8048611111111111 | 0 |
| 0.8055555555555555 | 0 |
| 0.80625 | 0 |
| 0.8069444444444445 | 0 |
| 0.8076388888888889 | 0 |
| 0.8083333333333332 | 0 |
| 0.8090277777777778 | 0 |
| 0.8097222222222222 | 0 |
| 0.8104166666666667 | 0 |
| 0.811111111111111 | 0 |
| 0.8118055555555556 | 0 |
| 0.8125 | 0 |
| 0.8131944444444444 | 0 |
| 0.813888888888889 | 0 |
| 0.8145833333333333 | 0 |
| 0.8152777777777778 | 0 |
| 0.8159722222222222 | 0 |
| 0.8166666666666668 | 0 |
| 0.8173611111111111 | 0 |
| 0.8180555555555555 | 0 |
| 0.81875 | 0 |
| 0.8194444444444445 | 0 |
| 0.8201388888888889 | 0 |
| 0.8208333333333333 | 0 |
| 0.8215277777777777 | 0 |
| 0.8222222222222223 | 0 |
| 0.8229166666666666 | 0 |
| 0.8236111111111111 | 0 |
| 0.8243055555555556 | 0 |
| 0.8250000000000001 | 0 |
| 0.8256944444444444 | 0 |
| 0.8263888888888888 | 0 |
| 0.8270833333333334 | 0 |
| 0.8277777777777778 | 0 |
| 0.8284722222222222 | 0 |
| 0.8291666666666666 | 0 |
| 0.8298611111111112 | 0 |
| 0.8305555555555556 | 0 |
| 0.8312499999999999 | 0 |
| 0.8319444444444444 | 0 |
| 0.8326388888888889 | 0 |
| 0.8333333333333334 | 0 |
| 0.8340277777777777 | 0 |
| 0.8347222222222223 | 0 |
| 0.8354166666666667 | 0 |
| 0.8361111111111111 | 0 |
| 0.8368055555555555 | 0 |
| 0.8375 | 0 |
| 0.8381944444444445 | 0 |
| 0.8388888888888889 | 0 |
| 0.8395833333333332 | 0 |
| 0.8402777777777778 | 0 |
| 0.8409722222222222 | 0 |
| 0.8416666666666667 | 0 |
| 0.842361111111111 | 0 |
| 0.8430555555555556 | 0 |
| 0.84375 | 0 |
| 0.8444444444444444 | 0 |
| 0.845138888888889 | 0 |
| 0.8458333333333333 | 0 |
| 0.8465277777777778 | 0 |
| 0.8472222222222222 | 0 |
| 0.8479166666666668 | 0 |
| 0.8486111111111111 | 0 |
| 0.8493055555555555 | 0 |
| 0.85 | 0 |
| 0.8506944444444445 | 0 |
| 0.8513888888888889 | 0 |
| 0.8520833333333333 | 0 |
| 0.8527777777777777 | 0 |
| 0.8534722222222223 | 0 |
| 0.8541666666666666 | 0 |
| 0.8548611111111111 | 0 |
| 0.8555555555555556 | 0 |
| 0.8562500000000001 | 0 |
| 0.8569444444444444 | 0 |
| 0.8576388888888888 | 0 |
| 0.8583333333333334 | 0 |
| 0.8590277777777778 | 0 |
| 0.8597222222222222 | 0 |
| 0.8604166666666666 | 0 |
| 0.8611111111111112 | 0 |
| 0.8618055555555556 | 0 |
| 0.8624999999999999 | 0 |
| 0.8631944444444444 | 0 |
| 0.8638888888888889 | 0 |
| 0.8645833333333334 | 0 |
| 0.8652777777777777 | 0 |
| 0.8659722222222223 | 0 |
| 0.8666666666666667 | 0 |
| 0.8673611111111111 | 0 |
| 0.8680555555555555 | 0 |
| 0.86875 | 0 |
| 0.8694444444444445 | 0 |
| 0.8701388888888889 | 0 |
| 0.8708333333333332 | 0 |
| 0.8715277777777778 | 0 |
| 0.8722222222222222 | 0 |
| 0.8729166666666667 | 0 |
| 0.873611111111111 | 0 |
| 0.8743055555555556 | 0 |
| 0.875 | 0 |
| 0.8756944444444444 | 0 |
| 0.876388888888889 | 0 |
| 0.8770833333333333 | 0 |
| 0.8777777777777778 | 0 |
| 0.8784722222222222 | 0 |
| 0.8791666666666668 | 0 |
| 0.8798611111111111 | 0 |
| 0.8805555555555555 | 0 |
| 0.88125 | 0 |
| 0.8819444444444445 | 0 |
| 0.8826388888888889 | 0 |
| 0.8833333333333333 | 0 |
| 0.8840277777777777 | 0 |
| 0.8847222222222223 | 0 |
| 0.8854166666666666 | 0 |
| 0.8861111111111111 | 0 |
| 0.8868055555555556 | 0 |
| 0.8875000000000001 | 0 |
| 0.8881944444444444 | 0 |
| 0.8888888888888888 | 0 |
| 0.8895833333333334 | 0 |
| 0.8902777777777778 | 0 |
| 0.8909722222222222 | 0 |
| 0.8916666666666666 | 0 |
| 0.8923611111111112 | 0 |
| 0.8930555555555556 | 0 |
| 0.8937499999999999 | 0 |
| 0.8944444444444444 | 0 |
| 0.8951388888888889 | 0 |
| 0.8958333333333334 | 0 |
| 0.8965277777777777 | 0 |
| 0.8972222222222223 | 0 |
| 0.8979166666666667 | 0 |
| 0.8986111111111111 | 0 |
| 0.8993055555555555 | 0 |
| 0.9 | 0 |
| 0.9006944444444445 | 0 |
| 0.9013888888888889 | 0 |
| 0.9020833333333332 | 0 |
| 0.9027777777777778 | 0 |
| 0.9034722222222222 | 0 |
| 0.9041666666666667 | 0 |
| 0.904861111111111 | 0 |
| 0.9055555555555556 | 0 |
| 0.90625 | 0 |
| 0.9069444444444444 | 0 |
| 0.907638888888889 | 0 |
| 0.9083333333333333 | 0 |
| 0.9090277777777778 | 0 |
| 0.9097222222222222 | 0 |
| 0.9104166666666668 | 0 |
| 0.9111111111111111 | 0 |
| 0.9118055555555555 | 0 |
| 0.9125 | 0 |
| 0.9131944444444445 | 0 |
| 0.9138888888888889 | 0 |
| 0.9145833333333333 | 0 |
| 0.9152777777777777 | 0 |
| 0.9159722222222223 | 0 |
| 0.9166666666666666 | 0 |
| 0.9173611111111111 | 0 |
| 0.9180555555555556 | 0 |
| 0.9187500000000001 | 0 |
| 0.9194444444444444 | 0 |
| 0.9201388888888888 | 0 |
| 0.9208333333333334 | 0 |
| 0.9215277777777778 | 0 |
| 0.9222222222222222 | 0 |
| 0.9229166666666666 | 0 |
| 0.9236111111111112 | 0 |
| 0.9243055555555556 | 0 |
| 0.9249999999999999 | 0 |
| 0.9256944444444444 | 0 |
| 0.9263888888888889 | 0 |
| 0.9270833333333334 | 0 |
| 0.9277777777777777 | 0 |
| 0.9284722222222223 | 0 |
| 0.9291666666666667 | 0 |
| 0.9298611111111111 | 0 |
| 0.9305555555555555 | 0 |
| 0.93125 | 0 |
| 0.9319444444444445 | 0 |
| 0.9326388888888889 | 0 |
| 0.9333333333333332 | 0 |
| 0.9340277777777778 | 0 |
| 0.9347222222222222 | 0 |
| 0.9354166666666667 | 0 |
| 0.936111111111111 | 0 |
| 0.9368055555555556 | 0 |
| 0.9375 | 0 |
| 0.9381944444444444 | 0 |
| 0.938888888888889 | 0 |
| 0.9395833333333333 | 0 |
| 0.9402777777777778 | 0 |
| 0.9409722222222222 | 0 |
| 0.9416666666666668 | 0 |
| 0.9423611111111111 | 0 |
| 0.9430555555555555 | 0 |
| 0.94375 | 0 |
| 0.9444444444444445 | 0 |
| 0.9451388888888889 | 0 |
| 0.9458333333333333 | 0 |
| 0.9465277777777777 | 0 |
| 0.9472222222222223 | 0 |
| 0.9479166666666666 | 0 |
| 0.9486111111111111 | 0 |
| 0.9493055555555556 | 0 |
| 0.9500000000000001 | 0 |
| 0.9506944444444444 | 0 |
| 0.9513888888888888 | 0 |
| 0.9520833333333334 | 0 |
| 0.9527777777777778 | 0 |
| 0.9534722222222222 | 0 |
| 0.9541666666666666 | 0 |
| 0.9548611111111112 | 0 |
| 0.9555555555555556 | 0 |
| 0.9562499999999999 | 0 |
| 0.9569444444444444 | 0 |
| 0.9576388888888889 | 0 |
| 0.9583333333333334 | 0 |
| 0.9590277777777777 | 0 |
| 0.9597222222222223 | 0 |
| 0.9604166666666667 | 0 |
| 0.9611111111111111 | 0 |
| 0.9618055555555555 | 0 |
| 0.9625 | 0 |
| 0.9631944444444445 | 0 |
| 0.9638888888888889 | 0 |
| 0.9645833333333332 | 0 |
| 0.9652777777777778 | 0 |
| 0.9659722222222222 | 0 |
| 0.9666666666666667 | 0 |
| 0.967361111111111 | 0 |
| 0.9680555555555556 | 0 |
| 0.96875 | 0 |
| 0.9694444444444444 | 0 |
| 0.970138888888889 | 0 |
| 0.9708333333333333 | 0 |
| 0.9715277777777778 | 0 |
| 0.9722222222222222 | 0 |
| 0.9729166666666668 | 0 |
| 0.9736111111111111 | 0 |
| 0.9743055555555555 | 0 |
| 0.975 | 0 |
| 0.9756944444444445 | 0 |
| 0.9763888888888889 | 0 |
| 0.9770833333333333 | 0 |
| 0.9777777777777777 | 0 |
| 0.9784722222222223 | 0 |
| 0.9791666666666666 | 0 |
| 0.9798611111111111 | 0 |
| 0.9805555555555556 | 0 |
| 0.9812500000000001 | 0 |
| 0.9819444444444444 | 0 |
| 0.9826388888888888 | 0 |
| 0.9833333333333334 | 0 |
| 0.9840277777777778 | 0 |
| 0.9847222222222222 | 0 |
| 0.9854166666666666 | 0 |
| 0.9861111111111112 | 0 |
| 0.9868055555555556 | 0 |
| 0.9874999999999999 | 0 |
| 0.9881944444444444 | 0 |
| 0.9888888888888889 | 0 |
| 0.9895833333333334 | 0 |
| 0.9902777777777777 | 0 |
| 0.9909722222222223 | 0 |
| 0.9916666666666667 | 0 |
| 0.9923611111111111 | 0 |
| 0.9930555555555555 | 0 |
| 0.99375 | 0 |
| 0.9944444444444445 | 0 |
| 0.9951388888888889 | 0 |
| 0.9958333333333332 | 0 |
| 0.9965277777777778 | 0 |
| 0.9972222222222222 | 0 |
| 0.9979166666666667 | 0 |
| 0.998611111111111 | 0 |
| 0.9993055555555556 | 0 |